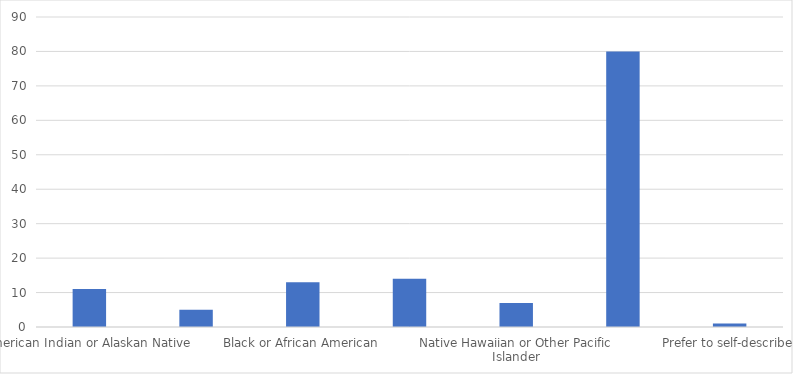
| Category | Number of Responses |
|---|---|
| American Indian or Alaskan Native | 11 |
| Asian | 5 |
| Black or African American | 13 |
| Hispanic or Latino/a/x | 14 |
| Native Hawaiian or Other Pacific Islander | 7 |
| White | 80 |
| Prefer to self-describe | 1 |